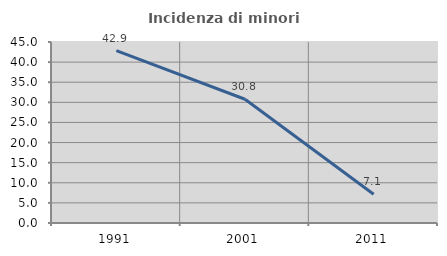
| Category | Incidenza di minori stranieri |
|---|---|
| 1991.0 | 42.857 |
| 2001.0 | 30.769 |
| 2011.0 | 7.143 |